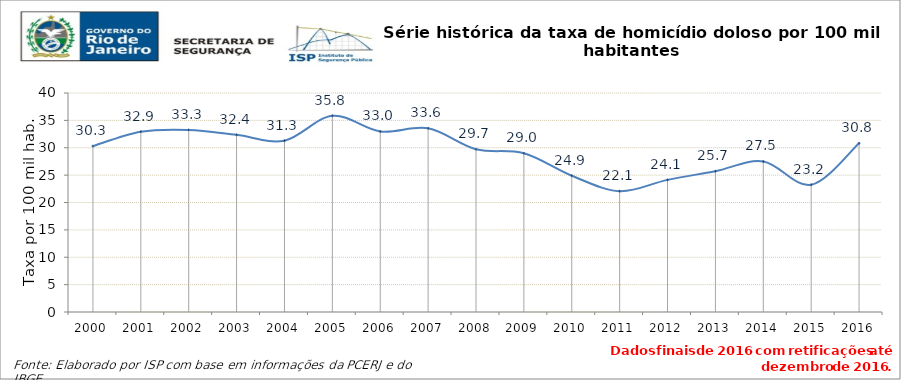
| Category | Series 0 |
|---|---|
| 2000.0 | 30.303 |
| 2001.0 | 32.931 |
| 2002.0 | 33.257 |
| 2003.0 | 32.356 |
| 2004.0 | 31.29 |
| 2005.0 | 35.834 |
| 2006.0 | 32.983 |
| 2007.0 | 33.557 |
| 2008.0 | 29.74 |
| 2009.0 | 28.993 |
| 2010.0 | 24.892 |
| 2011.0 | 22.069 |
| 2012.0 | 24.135 |
| 2013.0 | 25.715 |
| 2014.0 | 27.499 |
| 2015.0 | 23.231 |
| 2016.0 | 30.829 |